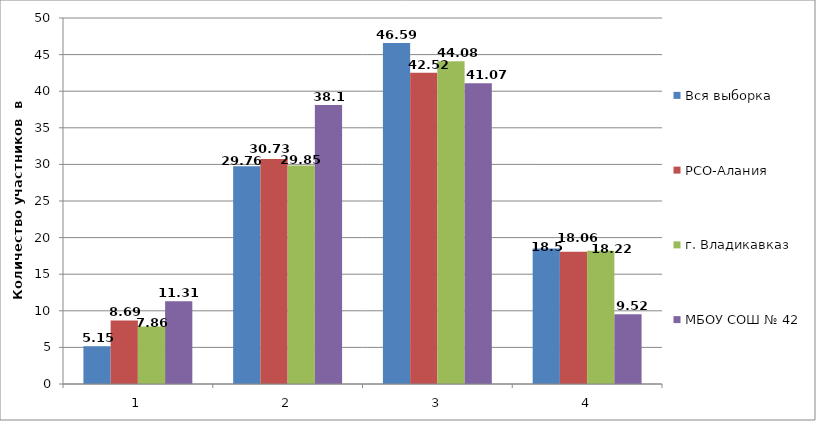
| Category | Вся выборка | РСО-Алания | г. Владикавказ | МБОУ СОШ № 42 |
|---|---|---|---|---|
| 0 | 5.15 | 8.69 | 7.86 | 11.31 |
| 1 | 29.76 | 30.73 | 29.85 | 38.1 |
| 2 | 46.59 | 42.52 | 44.08 | 41.07 |
| 3 | 18.5 | 18.06 | 18.22 | 9.52 |